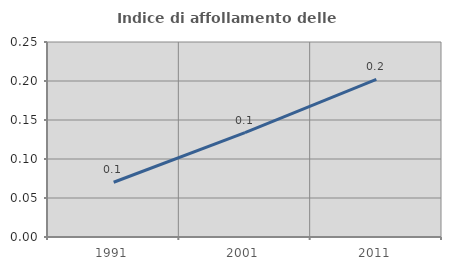
| Category | Indice di affollamento delle abitazioni  |
|---|---|
| 1991.0 | 0.07 |
| 2001.0 | 0.134 |
| 2011.0 | 0.202 |